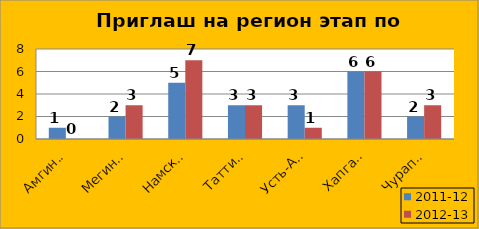
| Category | 2011-12 | 2012-13 |
|---|---|---|
| Амгинский | 1 | 0 |
| Мегино-Кангаласс | 2 | 3 |
| Намский | 5 | 7 |
| Таттинский | 3 | 3 |
| Усть-Алданский | 3 | 1 |
| Хапгаласский | 6 | 6 |
| Чурапчинский | 2 | 3 |